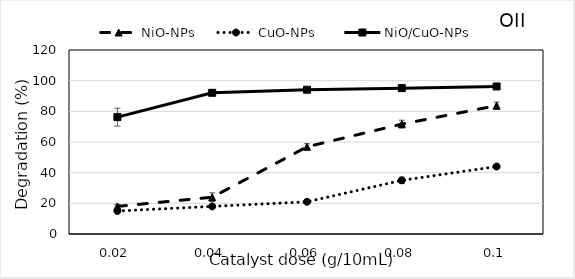
| Category | NiO-NPs | CuO-NPs  | NiO/CuO-NPs |
|---|---|---|---|
| 0.02 | 18 | 15 | 76.235 |
| 0.04 | 24 | 18 | 92.078 |
| 0.06 | 56.878 | 21 | 94.089 |
| 0.08 | 71.658 | 35 | 95.128 |
| 0.1 | 83.721 | 44 | 96.221 |